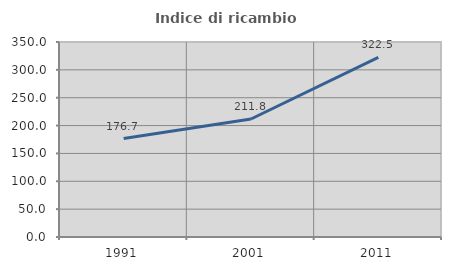
| Category | Indice di ricambio occupazionale  |
|---|---|
| 1991.0 | 176.667 |
| 2001.0 | 211.765 |
| 2011.0 | 322.535 |